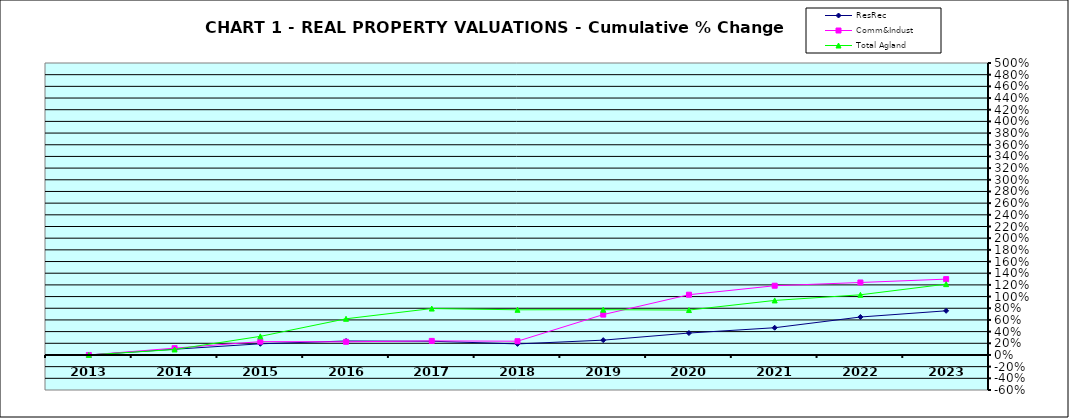
| Category | ResRec | Comm&Indust | Total Agland |
|---|---|---|---|
| 2013.0 | 0 | 0 | 0 |
| 2014.0 | 0.098 | 0.117 | 0.094 |
| 2015.0 | 0.191 | 0.228 | 0.319 |
| 2016.0 | 0.239 | 0.225 | 0.62 |
| 2017.0 | 0.235 | 0.241 | 0.795 |
| 2018.0 | 0.189 | 0.235 | 0.774 |
| 2019.0 | 0.254 | 0.691 | 0.775 |
| 2020.0 | 0.376 | 1.032 | 0.769 |
| 2021.0 | 0.466 | 1.186 | 0.934 |
| 2022.0 | 0.65 | 1.241 | 1.03 |
| 2023.0 | 0.756 | 1.299 | 1.213 |